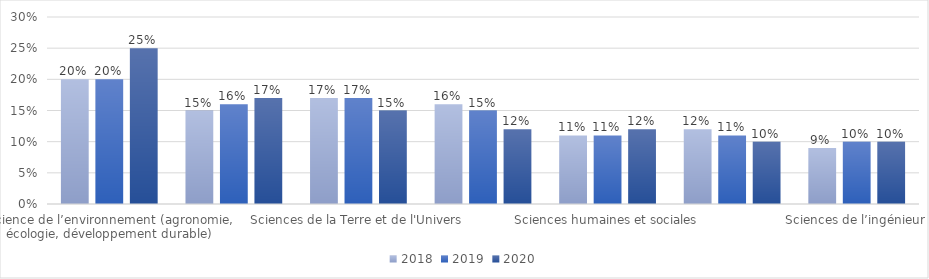
| Category | 2018 | 2019 | 2020 |
|---|---|---|---|
| Science de l’environnement (agronomie, écologie, développement durable) | 0.2 | 0.2 | 0.25 |
| Sciences de la vie et de la santé | 0.15 | 0.16 | 0.17 |
| Sciences de la Terre et de l'Univers | 0.17 | 0.17 | 0.15 |
| Sciences exactes (maths, physique, chimie) | 0.16 | 0.15 | 0.12 |
| Sciences humaines et sociales | 0.11 | 0.11 | 0.12 |
| Sciences numériques | 0.12 | 0.11 | 0.1 |
| Sciences de l’ingénieur | 0.09 | 0.1 | 0.1 |